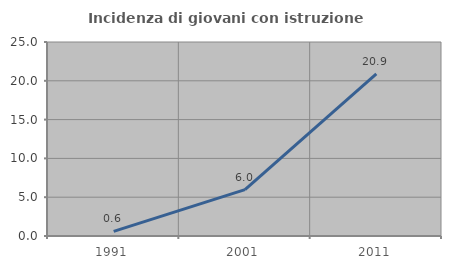
| Category | Incidenza di giovani con istruzione universitaria |
|---|---|
| 1991.0 | 0.595 |
| 2001.0 | 5.978 |
| 2011.0 | 20.896 |